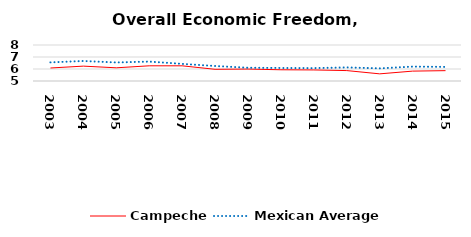
| Category | Campeche | Mexican Average  |
|---|---|---|
| 2003.0 | 6.084 | 6.552 |
| 2004.0 | 6.239 | 6.668 |
| 2005.0 | 6.1 | 6.546 |
| 2006.0 | 6.267 | 6.619 |
| 2007.0 | 6.265 | 6.428 |
| 2008.0 | 5.975 | 6.248 |
| 2009.0 | 5.994 | 6.106 |
| 2010.0 | 5.936 | 6.086 |
| 2011.0 | 5.921 | 6.074 |
| 2012.0 | 5.868 | 6.134 |
| 2013.0 | 5.595 | 6.054 |
| 2014.0 | 5.824 | 6.2 |
| 2015.0 | 5.863 | 6.174 |